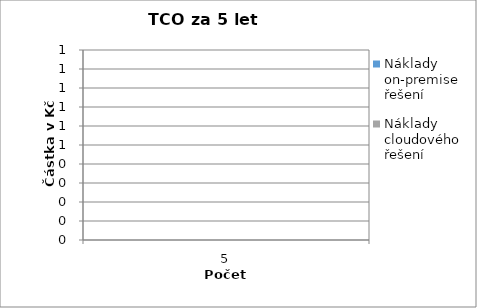
| Category | Náklady on-premise řešení | Náklady cloudového řešení |
|---|---|---|
| 5.0 | 0 | 0 |